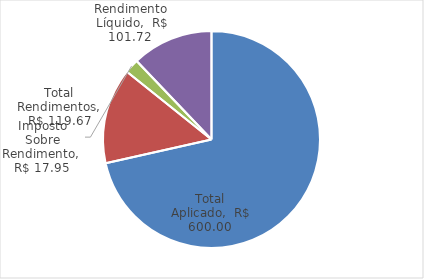
| Category | Series 0 |
|---|---|
| Total Aplicado | 600 |
| Total Rendimentos | 119.668 |
| Imposto Sobre Rendimento | 17.95 |
| Rendimento Líquido | 101.718 |